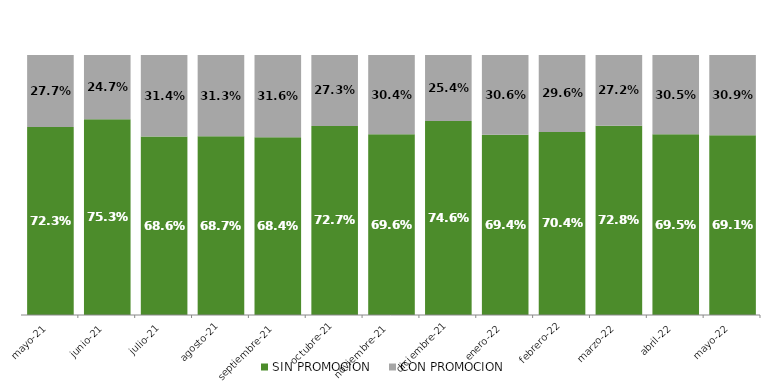
| Category | SIN PROMOCION   | CON PROMOCION   |
|---|---|---|
| 2021-05-01 | 0.723 | 0.277 |
| 2021-06-01 | 0.753 | 0.247 |
| 2021-07-01 | 0.686 | 0.314 |
| 2021-08-01 | 0.687 | 0.313 |
| 2021-09-01 | 0.684 | 0.316 |
| 2021-10-01 | 0.727 | 0.273 |
| 2021-11-01 | 0.696 | 0.304 |
| 2021-12-01 | 0.746 | 0.254 |
| 2022-01-01 | 0.694 | 0.306 |
| 2022-02-01 | 0.704 | 0.296 |
| 2022-03-01 | 0.728 | 0.272 |
| 2022-04-01 | 0.695 | 0.305 |
| 2022-05-01 | 0.691 | 0.309 |